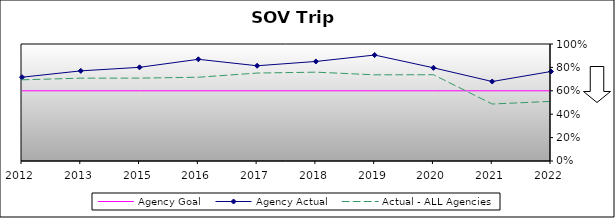
| Category | Agency Goal | Agency Actual | Actual - ALL Agencies |
|---|---|---|---|
| 2012.0 | 0.6 | 0.716 | 0.694 |
| 2013.0 | 0.6 | 0.77 | 0.708 |
| 2015.0 | 0.6 | 0.801 | 0.708 |
| 2016.0 | 0.6 | 0.869 | 0.716 |
| 2017.0 | 0.6 | 0.814 | 0.752 |
| 2018.0 | 0.6 | 0.851 | 0.759 |
| 2019.0 | 0.6 | 0.906 | 0.736 |
| 2020.0 | 0.6 | 0.796 | 0.737 |
| 2021.0 | 0.6 | 0.679 | 0.487 |
| 2022.0 | 0.6 | 0.765 | 0.509 |